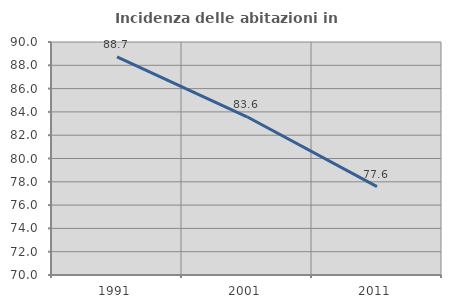
| Category | Incidenza delle abitazioni in proprietà  |
|---|---|
| 1991.0 | 88.727 |
| 2001.0 | 83.582 |
| 2011.0 | 77.58 |